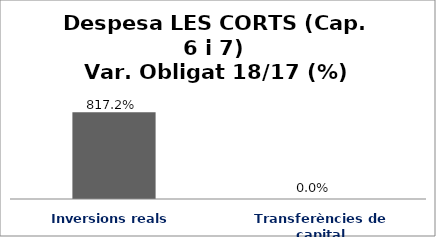
| Category | Series 0 |
|---|---|
| Inversions reals | 8.172 |
| Transferències de capital | 0 |